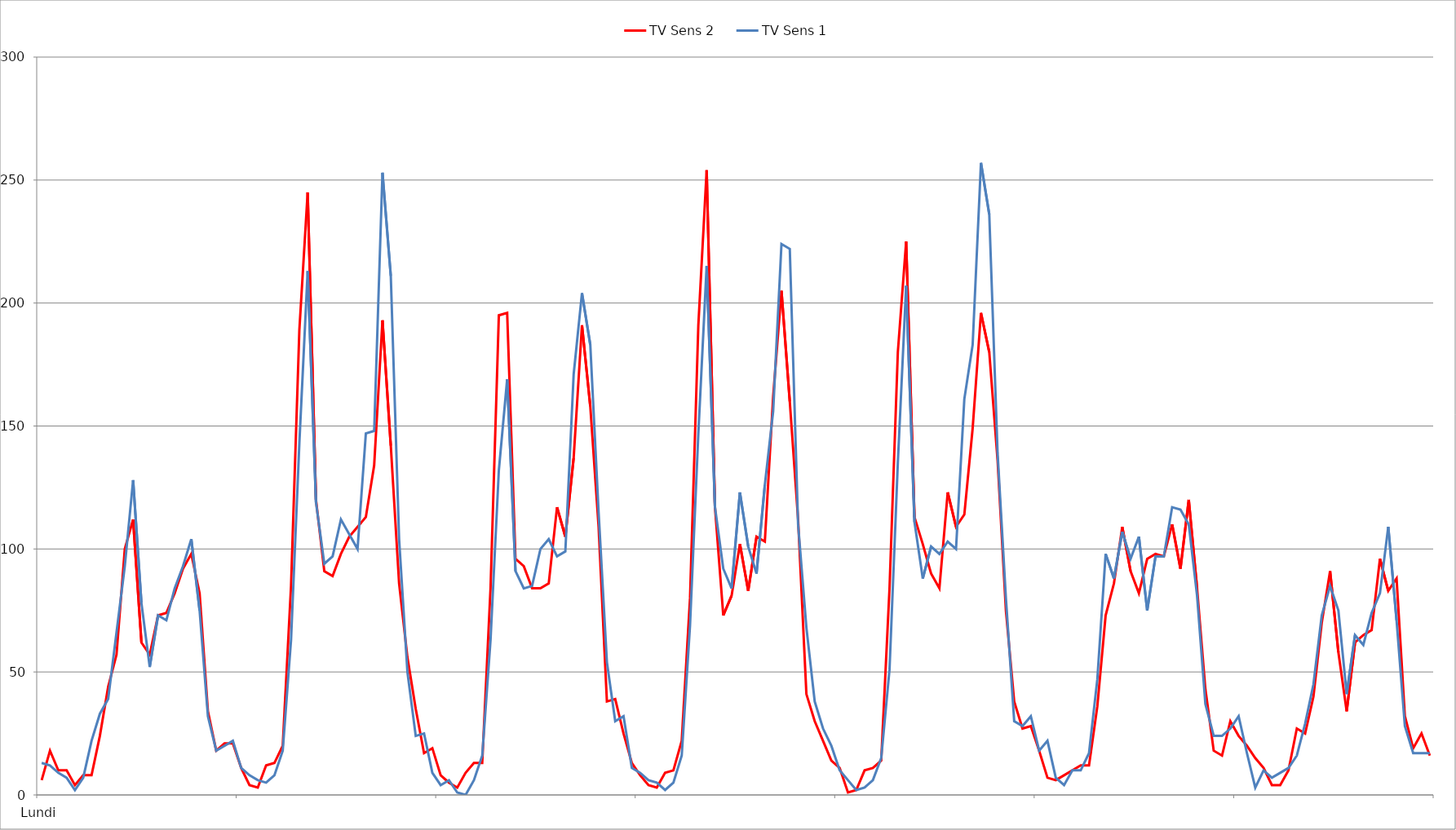
| Category | TV Sens 2 | TV Sens 1 |
|---|---|---|
| 0 | 6 | 13 |
| 1 | 18 | 12 |
| 2 | 10 | 9 |
| 3 | 10 | 7 |
| 4 | 4 | 2 |
| 5 | 8 | 7 |
| 6 | 8 | 22 |
| 7 | 24 | 33 |
| 8 | 44 | 39 |
| 9 | 57 | 66 |
| 10 | 100 | 93 |
| 11 | 112 | 128 |
| 12 | 62 | 78 |
| 13 | 57 | 52 |
| 14 | 73 | 73 |
| 15 | 74 | 71 |
| 16 | 82 | 84 |
| 17 | 92 | 93 |
| 18 | 98 | 104 |
| 19 | 82 | 75 |
| 20 | 34 | 32 |
| 21 | 18 | 18 |
| 22 | 21 | 20 |
| 23 | 21 | 22 |
| 24 | 11 | 11 |
| 25 | 4 | 8 |
| 26 | 3 | 6 |
| 27 | 12 | 5 |
| 28 | 13 | 8 |
| 29 | 20 | 18 |
| 30 | 85 | 63 |
| 31 | 189 | 143 |
| 32 | 245 | 213 |
| 33 | 120 | 119 |
| 34 | 91 | 94 |
| 35 | 89 | 97 |
| 36 | 98 | 112 |
| 37 | 105 | 106 |
| 38 | 109 | 100 |
| 39 | 113 | 147 |
| 40 | 134 | 148 |
| 41 | 193 | 253 |
| 42 | 142 | 211 |
| 43 | 86 | 104 |
| 44 | 56 | 50 |
| 45 | 35 | 24 |
| 46 | 17 | 25 |
| 47 | 19 | 9 |
| 48 | 8 | 4 |
| 49 | 5 | 6 |
| 50 | 3 | 1 |
| 51 | 9 | 0 |
| 52 | 13 | 6 |
| 53 | 13 | 16 |
| 54 | 84 | 63 |
| 55 | 195 | 132 |
| 56 | 196 | 169 |
| 57 | 96 | 91 |
| 58 | 93 | 84 |
| 59 | 84 | 85 |
| 60 | 84 | 100 |
| 61 | 86 | 104 |
| 62 | 117 | 97 |
| 63 | 105 | 99 |
| 64 | 137 | 171 |
| 65 | 191 | 204 |
| 66 | 158 | 183 |
| 67 | 109 | 115 |
| 68 | 38 | 54 |
| 69 | 39 | 30 |
| 70 | 25 | 32 |
| 71 | 13 | 11 |
| 72 | 8 | 9 |
| 73 | 4 | 6 |
| 74 | 3 | 5 |
| 75 | 9 | 2 |
| 76 | 10 | 5 |
| 77 | 22 | 16 |
| 78 | 80 | 69 |
| 79 | 191 | 147 |
| 80 | 254 | 215 |
| 81 | 117 | 117 |
| 82 | 73 | 92 |
| 83 | 81 | 84 |
| 84 | 102 | 123 |
| 85 | 83 | 101 |
| 86 | 105 | 90 |
| 87 | 103 | 126 |
| 88 | 162 | 156 |
| 89 | 205 | 224 |
| 90 | 160 | 222 |
| 91 | 112 | 110 |
| 92 | 41 | 68 |
| 93 | 30 | 38 |
| 94 | 22 | 27 |
| 95 | 14 | 20 |
| 96 | 11 | 10 |
| 97 | 1 | 6 |
| 98 | 2 | 2 |
| 99 | 10 | 3 |
| 100 | 11 | 6 |
| 101 | 14 | 15 |
| 102 | 84 | 51 |
| 103 | 180 | 135 |
| 104 | 225 | 207 |
| 105 | 113 | 111 |
| 106 | 102 | 88 |
| 107 | 90 | 101 |
| 108 | 84 | 98 |
| 109 | 123 | 103 |
| 110 | 109 | 100 |
| 111 | 114 | 161 |
| 112 | 149 | 183 |
| 113 | 196 | 257 |
| 114 | 180 | 236 |
| 115 | 136 | 139 |
| 116 | 75 | 80 |
| 117 | 38 | 30 |
| 118 | 27 | 28 |
| 119 | 28 | 32 |
| 120 | 18 | 18 |
| 121 | 7 | 22 |
| 122 | 6 | 7 |
| 123 | 8 | 4 |
| 124 | 10 | 10 |
| 125 | 12 | 10 |
| 126 | 12 | 17 |
| 127 | 36 | 47 |
| 128 | 73 | 98 |
| 129 | 86 | 88 |
| 130 | 109 | 107 |
| 131 | 91 | 96 |
| 132 | 82 | 105 |
| 133 | 96 | 75 |
| 134 | 98 | 97 |
| 135 | 97 | 97 |
| 136 | 110 | 117 |
| 137 | 92 | 116 |
| 138 | 120 | 110 |
| 139 | 84 | 81 |
| 140 | 43 | 37 |
| 141 | 18 | 24 |
| 142 | 16 | 24 |
| 143 | 30 | 27 |
| 144 | 24 | 32 |
| 145 | 20 | 17 |
| 146 | 15 | 3 |
| 147 | 11 | 10 |
| 148 | 4 | 7 |
| 149 | 4 | 9 |
| 150 | 10 | 11 |
| 151 | 27 | 16 |
| 152 | 25 | 29 |
| 153 | 40 | 45 |
| 154 | 70 | 73 |
| 155 | 91 | 85 |
| 156 | 58 | 75 |
| 157 | 34 | 41 |
| 158 | 62 | 65 |
| 159 | 65 | 61 |
| 160 | 67 | 74 |
| 161 | 96 | 82 |
| 162 | 83 | 109 |
| 163 | 88 | 71 |
| 164 | 32 | 28 |
| 165 | 19 | 17 |
| 166 | 25 | 17 |
| 167 | 16 | 17 |